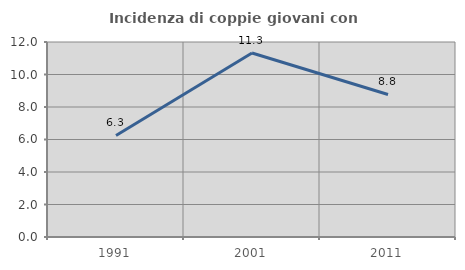
| Category | Incidenza di coppie giovani con figli |
|---|---|
| 1991.0 | 6.25 |
| 2001.0 | 11.321 |
| 2011.0 | 8.772 |